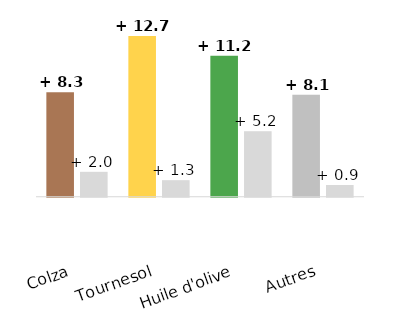
| Category | en % |
|---|---|
| Colza | 1.97 |
| Tournesol | 1.311 |
| Huile d'olive | 5.177 |
| Autres | 0.929 |